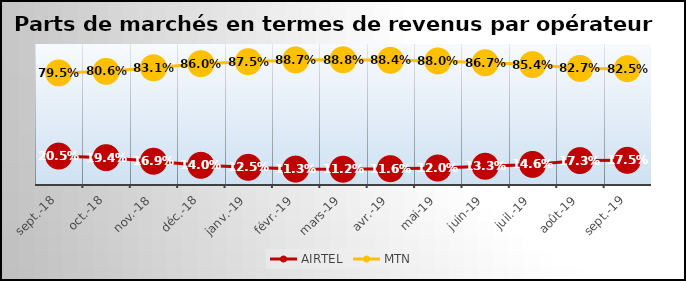
| Category | AIRTEL | MTN |
|---|---|---|
| 2018-09-01 | 0.205 | 0.795 |
| 2018-10-01 | 0.194 | 0.806 |
| 2018-11-01 | 0.169 | 0.831 |
| 2018-12-01 | 0.14 | 0.86 |
| 2019-01-01 | 0.125 | 0.875 |
| 2019-02-01 | 0.113 | 0.887 |
| 2019-03-01 | 0.112 | 0.888 |
| 2019-04-01 | 0.116 | 0.884 |
| 2019-05-01 | 0.12 | 0.88 |
| 2019-06-01 | 0.133 | 0.867 |
| 2019-07-01 | 0.146 | 0.854 |
| 2019-08-01 | 0.173 | 0.827 |
| 2019-09-01 | 0.175 | 0.825 |